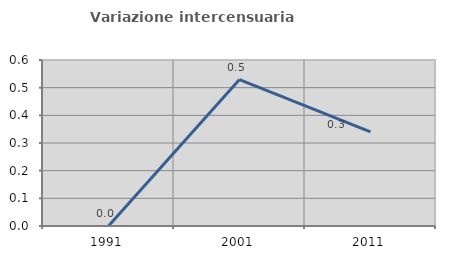
| Category | Variazione intercensuaria annua |
|---|---|
| 1991.0 | 0 |
| 2001.0 | 0.529 |
| 2011.0 | 0.34 |